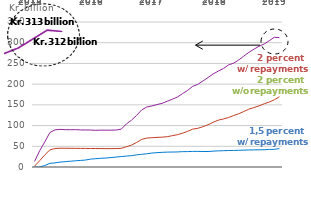
| Category | 1.5 per cent w/ repayments | 2 per cent w/ repayments | 2 per cent w/o repayments |
|---|---|---|---|
| 2015-01-01 | 0 | 13.407 | 2.018 |
| 2015-02-01 | 0.113 | 39.078 | 15.193 |
| 2015-03-01 | 3.54 | 60.597 | 29.176 |
| 2015-04-01 | 8.888 | 83.141 | 41.227 |
| 2015-05-01 | 9.917 | 89.684 | 44.673 |
| 2015-06-01 | 11.87 | 90.843 | 45.331 |
| 2015-07-01 | 12.825 | 90.124 | 45.31 |
| 2015-08-01 | 13.932 | 90.026 | 45.153 |
| 2015-09-01 | 14.958 | 90.141 | 45.004 |
| 2015-10-01 | 15.775 | 89.478 | 44.883 |
| 2015-11-01 | 16.851 | 89.314 | 44.769 |
| 2015-12-01 | 19.108 | 89.27 | 44.692 |
| 2016-01-01 | 20.006 | 88.56 | 44.616 |
| 2016-02-01 | 21.112 | 89.039 | 44.415 |
| 2016-03-01 | 21.734 | 88.892 | 44.306 |
| 2016-04-01 | 22.715 | 88.964 | 44.406 |
| 2016-05-01 | 23.997 | 89.23 | 44.439 |
| 2016-06-01 | 25.194 | 91.452 | 45.105 |
| 2016-07-01 | 26.326 | 103.925 | 48.869 |
| 2016-08-01 | 27.444 | 112.929 | 52.75 |
| 2016-09-01 | 29.16 | 124.6 | 59.181 |
| 2016-10-01 | 30.73 | 137.924 | 66.625 |
| 2016-11-01 | 31.847 | 144.75 | 69.868 |
| 2016-12-01 | 33.646 | 147.421 | 70.672 |
| 2017-01-01 | 34.613 | 150.732 | 71.566 |
| 2017-02-01 | 35.392 | 153.655 | 72.007 |
| 2017-03-01 | 35.916 | 158.696 | 73.162 |
| 2017-04-01 | 36.131 | 163.49 | 75.597 |
| 2017-05-01 | 36.332 | 168.894 | 77.975 |
| 2017-06-01 | 37.059 | 177.101 | 81.446 |
| 2017-07-01 | 37.18 | 184.809 | 86.072 |
| 2017-08-01 | 37.662 | 194.68 | 91.403 |
| 2017-09-01 | 37.691 | 199.494 | 93.364 |
| 2017-10-01 | 37.413 | 207.566 | 97.312 |
| 2017-11-01 | 37.386 | 216.046 | 101.91 |
| 2017-12-01 | 38.271 | 224.615 | 107.907 |
| 2018-01-01 | 38.952 | 231.408 | 113.091 |
| 2018-02-01 | 39.332 | 237.506 | 115.832 |
| 2018-03-01 | 39.681 | 246.213 | 119.402 |
| 2018-04-01 | 39.967 | 250.611 | 124.105 |
| 2018-05-01 | 40.361 | 258.015 | 128.419 |
| 2018-06-01 | 40.727 | 267.449 | 133.887 |
| 2018-07-01 | 41.093 | 276.732 | 139.567 |
| 2018-08-01 | 41.345 | 284.358 | 143.445 |
| 2018-09-01 | 41.506 | 291.498 | 147.635 |
| 2018-10-01 | 41.727 | 296.847 | 152.574 |
| 2018-11-01 | 42.43 | 304.872 | 156.755 |
| 2018-12-01 | 42.693 | 313.241 | 162.18 |
| 2019-01-01 | 44.529 | 312.142 | 169.705 |